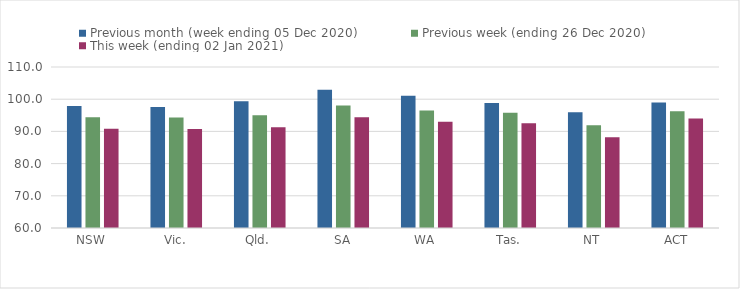
| Category | Previous month (week ending 05 Dec 2020) | Previous week (ending 26 Dec 2020) | This week (ending 02 Jan 2021) |
|---|---|---|---|
| NSW | 97.85 | 94.41 | 90.79 |
| Vic. | 97.6 | 94.28 | 90.75 |
| Qld. | 99.4 | 95 | 91.3 |
| SA | 102.9 | 98.05 | 94.36 |
| WA | 101.09 | 96.49 | 93 |
| Tas. | 98.82 | 95.83 | 92.53 |
| NT | 95.96 | 91.92 | 88.19 |
| ACT | 98.96 | 96.22 | 94.01 |